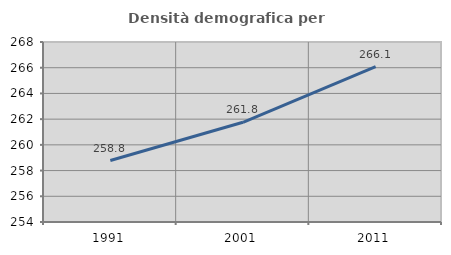
| Category | Densità demografica |
|---|---|
| 1991.0 | 258.78 |
| 2001.0 | 261.755 |
| 2011.0 | 266.089 |